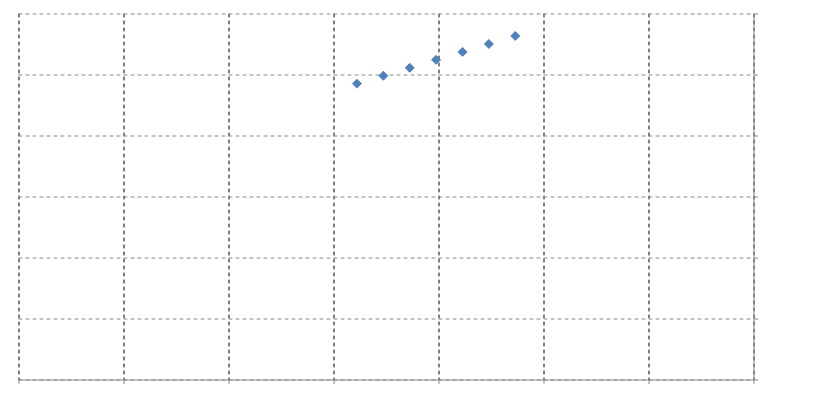
| Category | Series 0 |
|---|---|
| 94.89063013698629 | 40.372 |
| 94.76501369863013 | 40.398 |
| 94.63939726027397 | 40.424 |
| 94.51378082191782 | 40.45 |
| 94.38816438356166 | 40.476 |
| 94.2625479452055 | 40.502 |
| 94.13693150684935 | 40.528 |